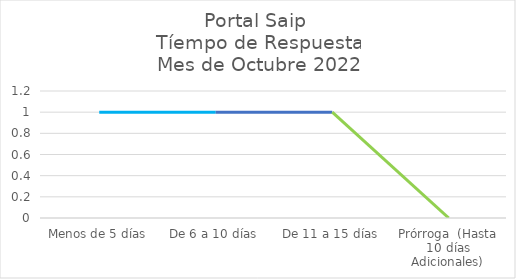
| Category | Series 0 |
|---|---|
| Menos de 5 días | 1 |
| De 6 a 10 días | 1 |
| De 11 a 15 días | 1 |
| Prórroga  (Hasta 10 días Adicionales) | 0 |